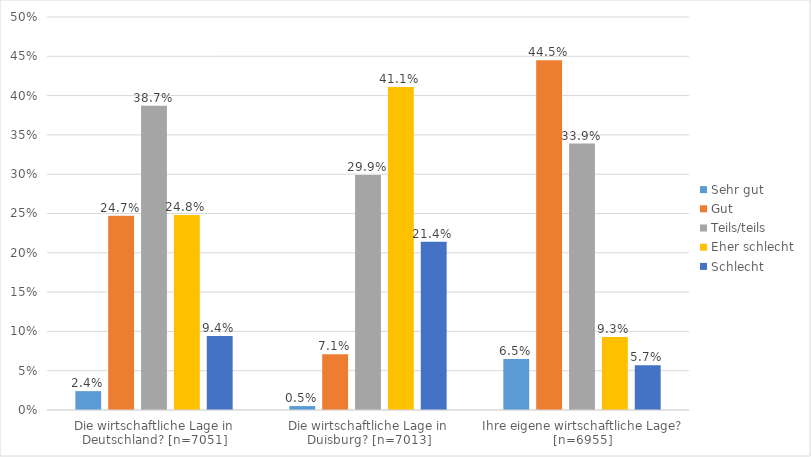
| Category | Sehr gut | Gut | Teils/teils | Eher schlecht | Schlecht |
|---|---|---|---|---|---|
| Die wirtschaftliche Lage in Deutschland? [n=7051] | 0.024 | 0.247 | 0.387 | 0.248 | 0.094 |
| Die wirtschaftliche Lage in Duisburg? [n=7013] | 0.005 | 0.071 | 0.299 | 0.411 | 0.214 |
| Ihre eigene wirtschaftliche Lage? [n=6955] | 0.065 | 0.445 | 0.339 | 0.093 | 0.057 |